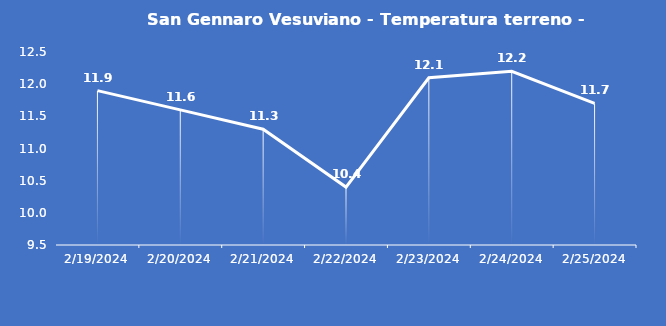
| Category | San Gennaro Vesuviano - Temperatura terreno - Grezzo (°C) |
|---|---|
| 2/19/24 | 11.9 |
| 2/20/24 | 11.6 |
| 2/21/24 | 11.3 |
| 2/22/24 | 10.4 |
| 2/23/24 | 12.1 |
| 2/24/24 | 12.2 |
| 2/25/24 | 11.7 |